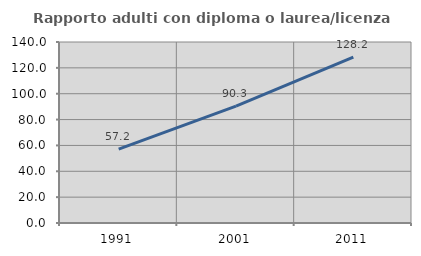
| Category | Rapporto adulti con diploma o laurea/licenza media  |
|---|---|
| 1991.0 | 57.194 |
| 2001.0 | 90.343 |
| 2011.0 | 128.221 |